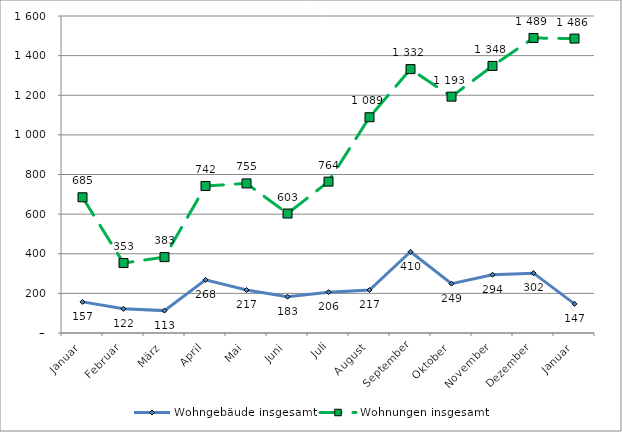
| Category | Wohngebäude insgesamt | Wohnungen insgesamt |
|---|---|---|
| Januar | 157 | 685 |
| Februar | 122 | 353 |
| März | 113 | 383 |
| April | 268 | 742 |
| Mai | 217 | 755 |
| Juni | 183 | 603 |
| Juli | 206 | 764 |
| August | 217 | 1089 |
| September | 410 | 1332 |
| Oktober | 249 | 1193 |
| November | 294 | 1348 |
| Dezember | 302 | 1489 |
| Januar | 147 | 1486 |